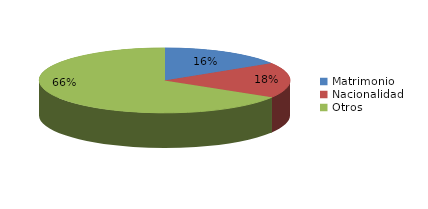
| Category | Series 0 |
|---|---|
| Matrimonio | 967 |
| Nacionalidad | 1059 |
| Otros | 3986 |